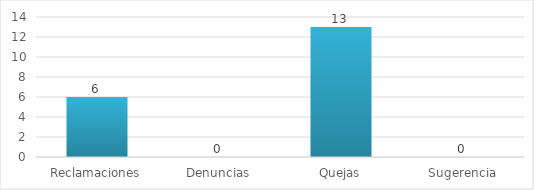
| Category | Series 0 |
|---|---|
| Reclamaciones | 6 |
| Denuncias | 0 |
| Quejas | 13 |
| Sugerencia | 0 |